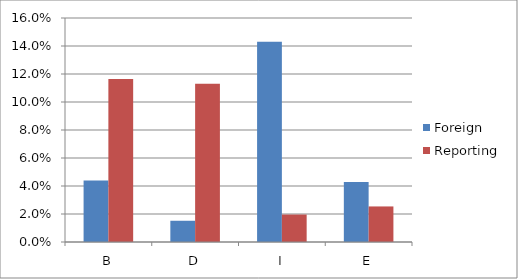
| Category | Foreign | Reporting |
|---|---|---|
| B | 0.044 | 0.116 |
| D | 0.015 | 0.113 |
| I | 0.143 | 0.02 |
| E | 0.043 | 0.025 |